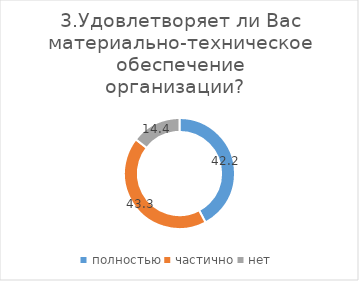
| Category | Series 0 |
|---|---|
| полностью | 42.222 |
| частично | 43.333 |
| нет | 14.444 |